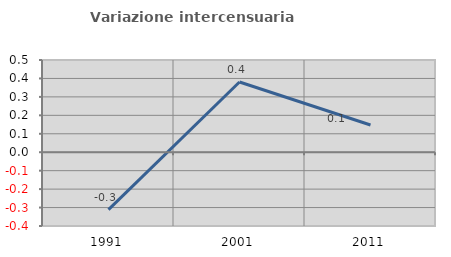
| Category | Variazione intercensuaria annua |
|---|---|
| 1991.0 | -0.311 |
| 2001.0 | 0.381 |
| 2011.0 | 0.147 |